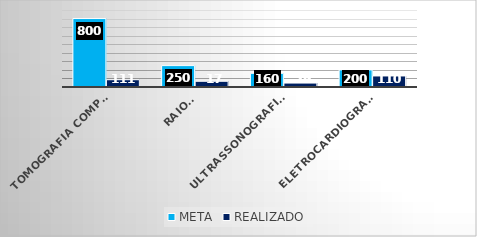
| Category | META | REALIZADO |
|---|---|---|
| Tomografia computadorizada | 800 | 85 |
| Raio x | 250 | 67 |
| Ultrassonografia/ Doppler  | 160 | 46 |
| Eletrocardiograma | 200 | 129 |